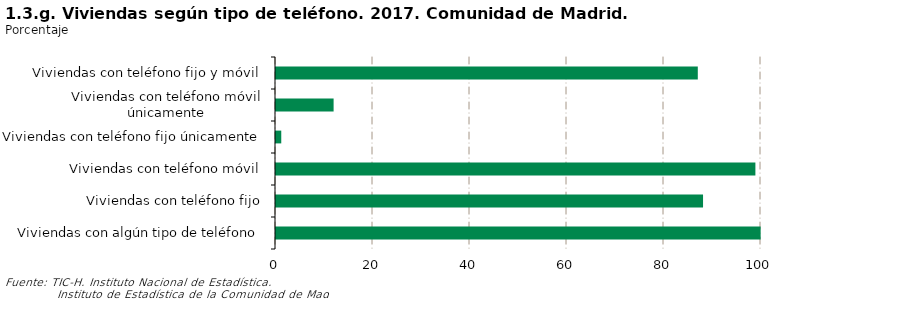
| Category | Series 0 |
|---|---|
| Viviendas con algún tipo de teléfono | 99.928 |
| Viviendas con teléfono fijo | 88.051 |
| Viviendas con teléfono móvil | 98.844 |
| Viviendas con teléfono fijo únicamente | 1.084 |
| Viviendas con teléfono móvil únicamente | 11.877 |
| Viviendas con teléfono fijo y móvil | 86.967 |